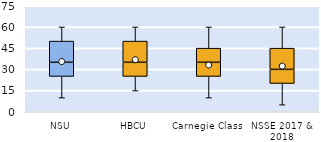
| Category | 25th | 50th | 75th |
|---|---|---|---|
| NSU | 25 | 10 | 15 |
| HBCU | 25 | 10 | 15 |
| Carnegie Class | 25 | 10 | 10 |
| NSSE 2017 & 2018 | 20 | 10 | 15 |